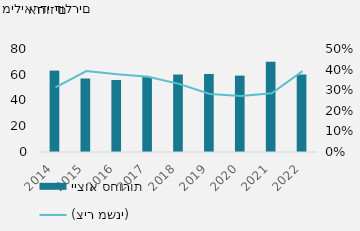
| Category | ייצוא סחורות |
|---|---|
| 2014 | 63220.1 |
| 2015 | 57075.9 |
| 2016 | 55928.5 |
| 2017 | 58178.9 |
| 2018 | 60170.7 |
| 2019 | 60630.1 |
| 2020 | 59322.7 |
| 2021 | 70133.3 |
| 2022 | 60174.4 |